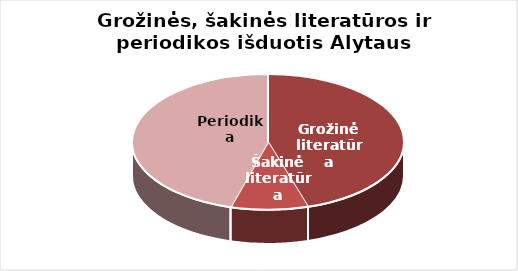
| Category | Series 0 |
|---|---|
| Grožinė literatūra | 500491 |
| Šakinė literatūra | 101483 |
| Periodika | 503993 |